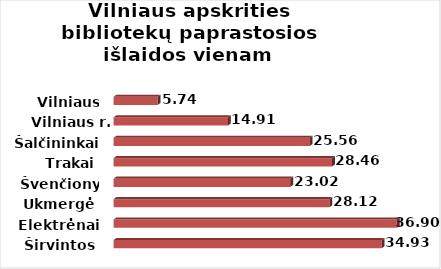
| Category | Series 0 |
|---|---|
| Širvintos | 34.926 |
| Elektrėnai | 36.901 |
| Ukmergė | 28.118 |
| Švenčionys | 23.023 |
| Trakai | 28.461 |
| Šalčininkai | 25.559 |
| Vilniaus r. | 14.906 |
| Vilniaus m. | 5.742 |